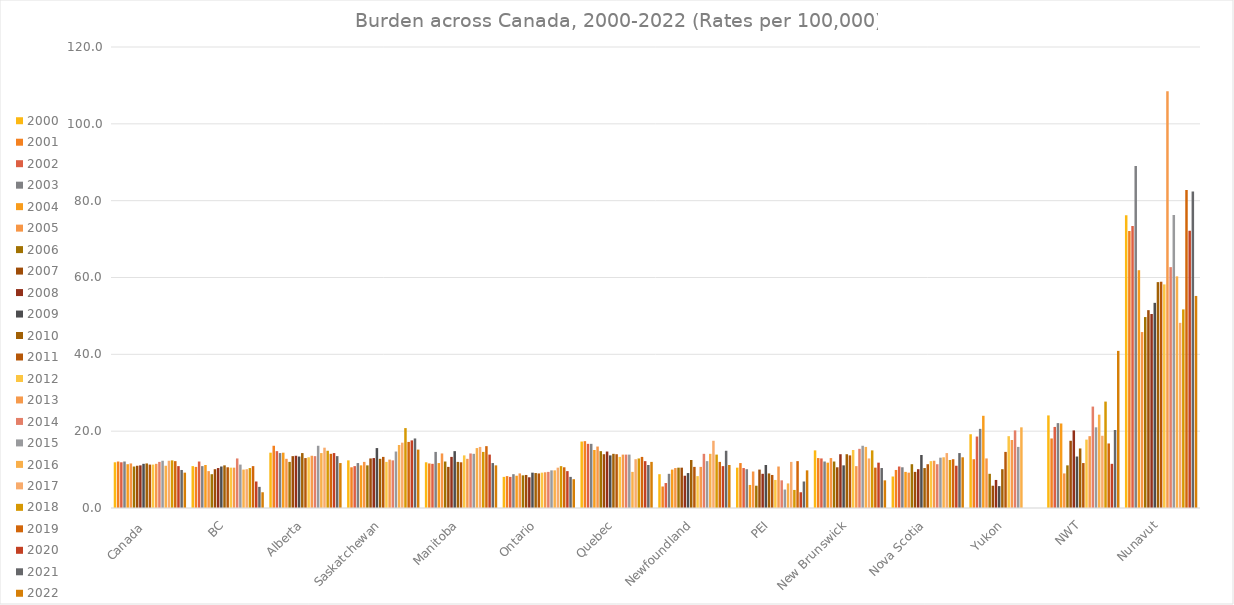
| Category | 2000 | 2001 | 2002 | 2003 | 2004 | 2005 | 2006 | 2007 | 2008 | 2009 | 2010 | 2011 | 2012 | 2013 | 2014 | 2015 | 2016 | 2017 | 2018 | 2019 | 2020 | 2021 | 2022 |
|---|---|---|---|---|---|---|---|---|---|---|---|---|---|---|---|---|---|---|---|---|---|---|---|
| Canada  | 11.9 | 12.1 | 11.9 | 12.1 | 11.4 | 11.6 | 10.8 | 11 | 11.1 | 11.5 | 11.6 | 11.3 | 11.3 | 11.5 | 12 | 12.3 | 11 | 12.3 | 12.4 | 12.2 | 10.9 | 9.9 | 9.2 |
| BC | 10.9 | 10.7 | 12.1 | 10.9 | 11.2 | 9.6 | 8.8 | 10.1 | 10.4 | 10.8 | 11.1 | 10.6 | 10.5 | 10.5 | 12.9 | 11.3 | 10 | 10.1 | 10.4 | 10.9 | 6.9 | 5.5 | 4.1 |
| Alberta | 14.4 | 16.2 | 14.8 | 14.3 | 14.4 | 12.8 | 12 | 13.5 | 13.6 | 13.4 | 14.3 | 13 | 13.2 | 13.6 | 13.5 | 16.2 | 14.3 | 15.7 | 14.9 | 14.1 | 14.3 | 13.5 | 11.7 |
| Saskatchewan | 12.4 | 10.6 | 10.9 | 11.7 | 11.1 | 12 | 11.1 | 12.9 | 13 | 15.6 | 12.8 | 13.3 | 12 | 12.6 | 12.4 | 14.7 | 16.4 | 17 | 20.8 | 17.2 | 17.6 | 18.1 | 15.2 |
| Manitoba | 11.9 | 11.6 | 11.5 | 14.6 | 11.7 | 14.2 | 12.1 | 10.7 | 13.3 | 14.8 | 12 | 11.9 | 13.7 | 12.8 | 14.2 | 14.1 | 15.6 | 15.9 | 14.6 | 16.1 | 13.9 | 11.7 | 11.1 |
| Ontario | 8.1 | 8.3 | 8.1 | 8.8 | 8.4 | 9 | 8.5 | 8.6 | 8 | 9.2 | 9.1 | 9 | 9.2 | 9.3 | 9.4 | 9.8 | 9.8 | 10.5 | 10.9 | 10.6 | 9.6 | 8.1 | 7.5 |
| Quebec | 17.3 | 17.4 | 16.7 | 16.7 | 15.1 | 16 | 14.8 | 14 | 14.7 | 13.7 | 14.1 | 14 | 13.3 | 13.9 | 13.9 | 13.9 | 9.4 | 12.7 | 12.9 | 13.3 | 12.2 | 11.2 | 12 |
| Newfoundland | 8.8 | 5.6 | 6.5 | 8.9 | 10 | 10.4 | 10.5 | 10.5 | 8.4 | 9.1 | 12.5 | 10.7 | 8.3 | 10.7 | 14.1 | 12.2 | 14.1 | 17.5 | 13.9 | 12 | 10.9 | 14.9 | 11.2 |
| PEI | 10.5 | 11.7 | 10.4 | 10.1 | 6 | 9.5 | 5.8 | 10 | 8.9 | 11.2 | 9 | 8.6 | 7.3 | 10.8 | 7.2 | 4.8 | 6.4 | 12 | 4.7 | 12.2 | 4.1 | 6.9 | 9.8 |
| New Brunswick | 15 | 13 | 12.9 | 12.1 | 11.8 | 13 | 12.1 | 10.6 | 14 | 11.1 | 14 | 13.7 | 15.1 | 10.9 | 15.4 | 16.2 | 15.9 | 12.9 | 15 | 10.5 | 11.8 | 10.4 | 7.2 |
| Nova Scotia | 8.2 | 9.9 | 10.8 | 10.6 | 9.4 | 9.2 | 11.4 | 9.4 | 10.1 | 13.8 | 10.4 | 11.4 | 12.2 | 12.3 | 11.4 | 13.1 | 13.2 | 14.3 | 12.5 | 12.7 | 11 | 14.3 | 13.2 |
| Yukon | 19.2 | 12.7 | 18.6 | 20.6 | 24 | 12.9 | 8.9 | 5.8 | 7.3 | 5.7 | 10.1 | 14.6 | 18.7 | 17.7 | 20.2 | 15.9 | 21 | 0 | 0 | 0 | 0 | 0 | 0 |
| NWT | 24.1 | 18.1 | 21.1 | 22.1 | 22 | 9 | 11.1 | 17.5 | 20.2 | 13.4 | 15.5 | 11.7 | 17.8 | 18.7 | 26.4 | 21 | 24.3 | 18.8 | 27.7 | 16.8 | 11.5 | 20.3 | 40.9 |
| Nunavut | 76.2 | 72.1 | 73.4 | 89 | 61.9 | 45.8 | 49.7 | 51.5 | 50.5 | 53.4 | 58.8 | 58.9 | 58.2 | 108.5 | 62.7 | 76.3 | 60.3 | 48.2 | 51.7 | 82.8 | 72.2 | 82.4 | 55.2 |